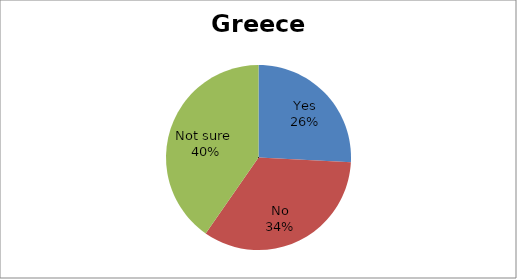
| Category | Series 0 |
|---|---|
| Yes | 16 |
| No | 21 |
| Not sure  | 25 |